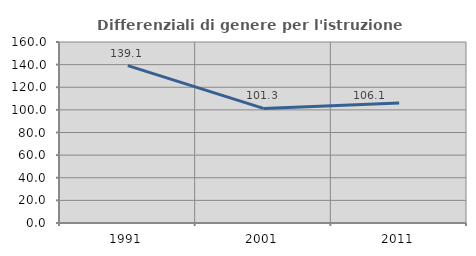
| Category | Differenziali di genere per l'istruzione superiore |
|---|---|
| 1991.0 | 139.13 |
| 2001.0 | 101.287 |
| 2011.0 | 106.137 |